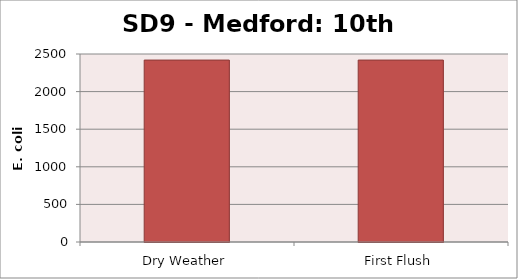
| Category | E. coli MPN |
|---|---|
| Dry Weather | 2419.2 |
| First Flush | 2419.2 |